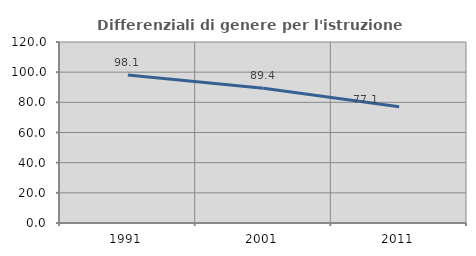
| Category | Differenziali di genere per l'istruzione superiore |
|---|---|
| 1991.0 | 98.07 |
| 2001.0 | 89.369 |
| 2011.0 | 77.095 |